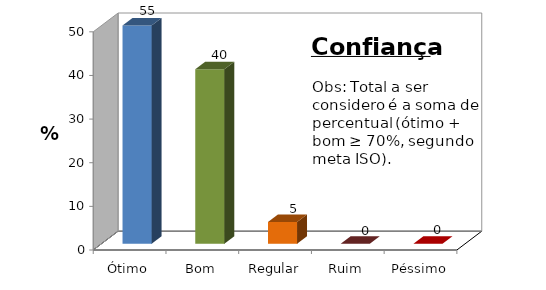
| Category | Series 0 |
|---|---|
| Ótimo | 55 |
| Bom | 40 |
| Regular | 5 |
| Ruim | 0 |
| Péssimo | 0 |